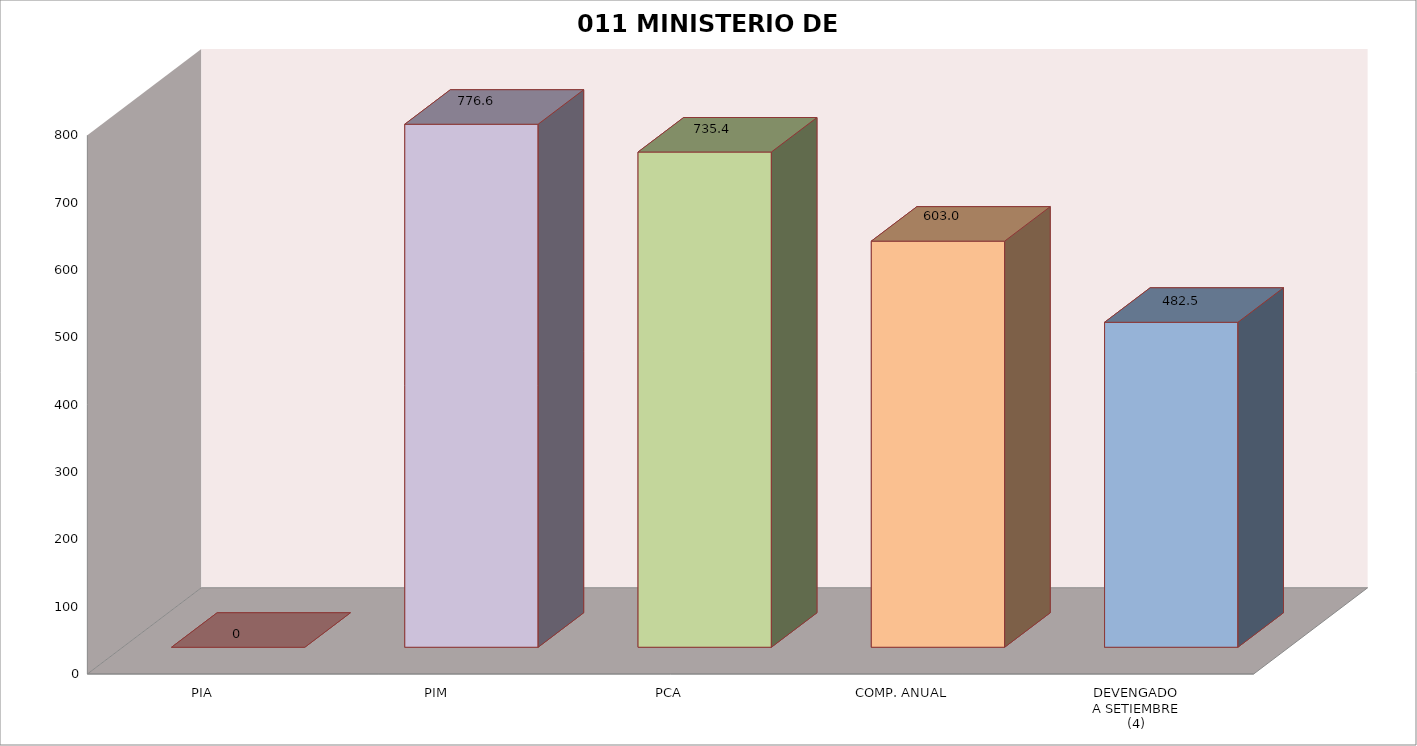
| Category | 011 MINISTERIO DE SALUD |
|---|---|
| PIA | 0 |
| PIM | 776.642 |
| PCA | 735.393 |
| COMP. ANUAL | 603.036 |
| DEVENGADO
A SETIEMBRE
(4) | 482.532 |